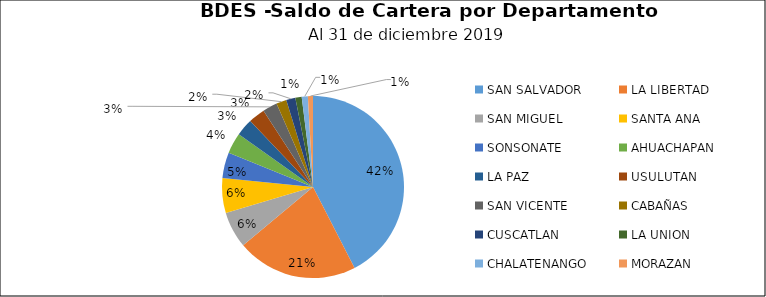
| Category | Saldo | Créditos |
|---|---|---|
| SAN SALVADOR | 169.345 | 6946 |
| LA LIBERTAD | 85.642 | 1988 |
| SAN MIGUEL | 25.794 | 1978 |
| SANTA ANA | 24.684 | 1603 |
| SONSONATE | 18.19 | 1110 |
| AHUACHAPAN | 14.713 | 763 |
| LA PAZ | 12.241 | 1273 |
| USULUTAN | 11.778 | 1227 |
| SAN VICENTE | 10.357 | 679 |
| CABAÑAS | 7.237 | 140 |
| CUSCATLAN | 6.499 | 427 |
| LA UNION | 4.502 | 574 |
| CHALATENANGO | 4.343 | 197 |
| MORAZAN | 3.588 | 485 |